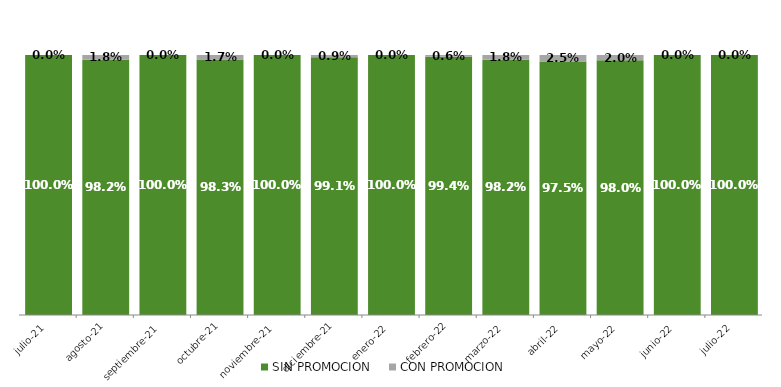
| Category | SIN PROMOCION   | CON PROMOCION   |
|---|---|---|
| 2021-07-01 | 1 | 0 |
| 2021-08-01 | 0.982 | 0.018 |
| 2021-09-01 | 1 | 0 |
| 2021-10-01 | 0.983 | 0.017 |
| 2021-11-01 | 1 | 0 |
| 2021-12-01 | 0.991 | 0.009 |
| 2022-01-01 | 1 | 0 |
| 2022-02-01 | 0.994 | 0.006 |
| 2022-03-01 | 0.982 | 0.018 |
| 2022-04-01 | 0.975 | 0.025 |
| 2022-05-01 | 0.98 | 0.02 |
| 2022-06-01 | 1 | 0 |
| 2022-07-01 | 1 | 0 |